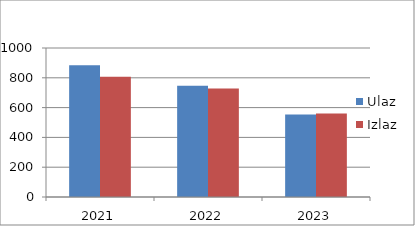
| Category | Ulaz | Izlaz |
|---|---|---|
| 2021.0 | 884 | 807 |
| 2022.0 | 747 | 728 |
| 2023.0 | 553 | 561 |